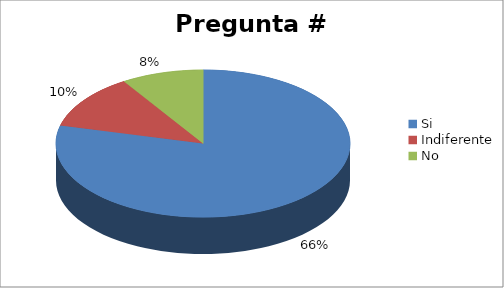
| Category | Series 0 |
|---|---|
| Si | 0.655 |
| Indiferente | 0.1 |
| No | 0.075 |